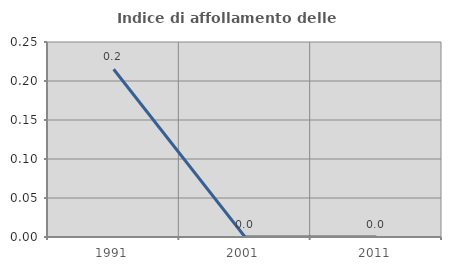
| Category | Indice di affollamento delle abitazioni  |
|---|---|
| 1991.0 | 0.215 |
| 2001.0 | 0 |
| 2011.0 | 0 |